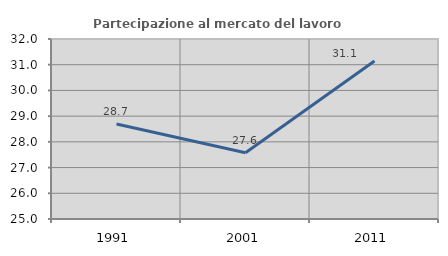
| Category | Partecipazione al mercato del lavoro  femminile |
|---|---|
| 1991.0 | 28.696 |
| 2001.0 | 27.576 |
| 2011.0 | 31.148 |